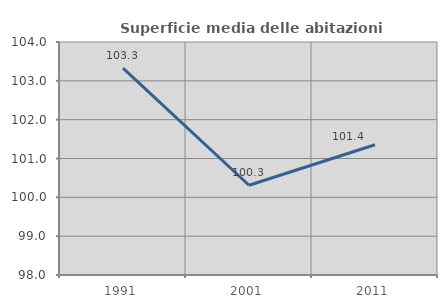
| Category | Superficie media delle abitazioni occupate |
|---|---|
| 1991.0 | 103.326 |
| 2001.0 | 100.31 |
| 2011.0 | 101.355 |